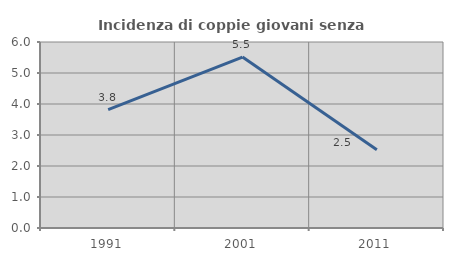
| Category | Incidenza di coppie giovani senza figli |
|---|---|
| 1991.0 | 3.817 |
| 2001.0 | 5.515 |
| 2011.0 | 2.527 |